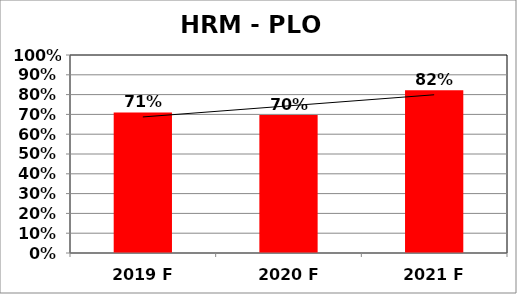
| Category | Series 0 |
|---|---|
| 2019 F | 0.71 |
| 2020 F | 0.697 |
| 2021 F | 0.822 |